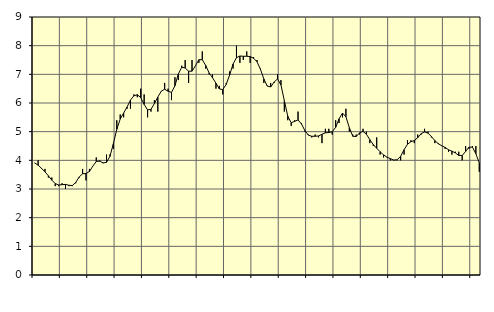
| Category | Piggar | Series 1 |
|---|---|---|
| nan | 3.9 | 3.91 |
| 87.0 | 4 | 3.83 |
| 87.0 | 3.7 | 3.72 |
| 87.0 | 3.7 | 3.6 |
| nan | 3.4 | 3.46 |
| 88.0 | 3.4 | 3.31 |
| 88.0 | 3.1 | 3.19 |
| 88.0 | 3.1 | 3.14 |
| nan | 3.2 | 3.15 |
| 89.0 | 3 | 3.16 |
| 89.0 | 3.1 | 3.13 |
| 89.0 | 3.1 | 3.12 |
| nan | 3.2 | 3.23 |
| 90.0 | 3.4 | 3.42 |
| 90.0 | 3.7 | 3.53 |
| 90.0 | 3.3 | 3.54 |
| nan | 3.7 | 3.61 |
| 91.0 | 3.8 | 3.8 |
| 91.0 | 4.1 | 3.96 |
| 91.0 | 4 | 3.97 |
| nan | 3.9 | 3.91 |
| 92.0 | 4.2 | 3.93 |
| 92.0 | 4.2 | 4.14 |
| 92.0 | 4.4 | 4.58 |
| nan | 5.4 | 5.08 |
| 93.0 | 5.6 | 5.44 |
| 93.0 | 5.5 | 5.65 |
| 93.0 | 5.8 | 5.86 |
| nan | 5.8 | 6.1 |
| 94.0 | 6.3 | 6.25 |
| 94.0 | 6.2 | 6.29 |
| 94.0 | 6.5 | 6.19 |
| nan | 6.3 | 5.95 |
| 95.0 | 5.5 | 5.76 |
| 95.0 | 5.7 | 5.78 |
| 95.0 | 6.1 | 5.98 |
| nan | 5.7 | 6.21 |
| 96.0 | 6.4 | 6.41 |
| 96.0 | 6.7 | 6.48 |
| 96.0 | 6.5 | 6.41 |
| nan | 6.1 | 6.37 |
| 97.0 | 6.9 | 6.6 |
| 97.0 | 6.8 | 7.01 |
| 97.0 | 7.3 | 7.25 |
| nan | 7.5 | 7.22 |
| 98.0 | 6.7 | 7.11 |
| 98.0 | 7.5 | 7.11 |
| 98.0 | 7.3 | 7.3 |
| nan | 7.4 | 7.51 |
| 99.0 | 7.8 | 7.51 |
| 99.0 | 7.2 | 7.31 |
| 99.0 | 7 | 7.05 |
| nan | 7 | 6.88 |
| 0.0 | 6.5 | 6.69 |
| 0.0 | 6.6 | 6.49 |
| 0.0 | 6.3 | 6.47 |
| nan | 6.7 | 6.65 |
| 1.0 | 7.1 | 6.98 |
| 1.0 | 7.2 | 7.36 |
| 1.0 | 8 | 7.58 |
| nan | 7.4 | 7.64 |
| 2.0 | 7.5 | 7.63 |
| 2.0 | 7.8 | 7.63 |
| 2.0 | 7.4 | 7.62 |
| nan | 7.6 | 7.56 |
| 3.0 | 7.5 | 7.44 |
| 3.0 | 7.2 | 7.18 |
| 3.0 | 6.7 | 6.84 |
| nan | 6.6 | 6.59 |
| 4.0 | 6.7 | 6.56 |
| 4.0 | 6.7 | 6.73 |
| 4.0 | 7 | 6.84 |
| nan | 6.8 | 6.63 |
| 5.0 | 5.7 | 6.08 |
| 5.0 | 5.4 | 5.54 |
| 5.0 | 5.2 | 5.31 |
| nan | 5.4 | 5.36 |
| 6.0 | 5.7 | 5.41 |
| 6.0 | 5.3 | 5.27 |
| 6.0 | 5 | 5.04 |
| nan | 4.9 | 4.88 |
| 7.0 | 4.8 | 4.84 |
| 7.0 | 4.9 | 4.84 |
| 7.0 | 4.8 | 4.85 |
| nan | 4.6 | 4.91 |
| 8.0 | 5.1 | 4.96 |
| 8.0 | 5.1 | 4.97 |
| 8.0 | 4.9 | 5 |
| nan | 5.4 | 5.15 |
| 9.0 | 5.3 | 5.45 |
| 9.0 | 5.5 | 5.65 |
| 9.0 | 5.8 | 5.52 |
| nan | 5 | 5.14 |
| 10.0 | 4.9 | 4.84 |
| 10.0 | 4.9 | 4.83 |
| 10.0 | 4.9 | 4.96 |
| nan | 5.1 | 5.01 |
| 11.0 | 5 | 4.91 |
| 11.0 | 4.6 | 4.72 |
| 11.0 | 4.5 | 4.55 |
| nan | 4.8 | 4.42 |
| 12.0 | 4.2 | 4.3 |
| 12.0 | 4.1 | 4.19 |
| 12.0 | 4.1 | 4.11 |
| nan | 4 | 4.06 |
| 13.0 | 4 | 4.01 |
| 13.0 | 4 | 4.02 |
| 13.0 | 4 | 4.14 |
| nan | 4.2 | 4.37 |
| 14.0 | 4.7 | 4.56 |
| 14.0 | 4.7 | 4.65 |
| 14.0 | 4.6 | 4.69 |
| nan | 4.9 | 4.79 |
| 15.0 | 4.9 | 4.93 |
| 15.0 | 5.1 | 4.99 |
| 15.0 | 5 | 4.95 |
| nan | 4.8 | 4.83 |
| 16.0 | 4.6 | 4.69 |
| 16.0 | 4.6 | 4.58 |
| 16.0 | 4.5 | 4.51 |
| nan | 4.4 | 4.45 |
| 17.0 | 4.3 | 4.37 |
| 17.0 | 4.2 | 4.32 |
| 17.0 | 4.3 | 4.26 |
| nan | 4.3 | 4.17 |
| 18.0 | 4 | 4.17 |
| 18.0 | 4.5 | 4.31 |
| 18.0 | 4.4 | 4.46 |
| nan | 4.5 | 4.46 |
| 19.0 | 4.5 | 4.23 |
| 19.0 | 3.6 | 3.91 |